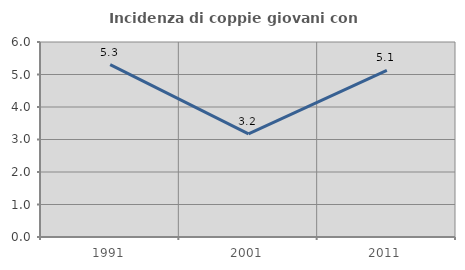
| Category | Incidenza di coppie giovani con figli |
|---|---|
| 1991.0 | 5.303 |
| 2001.0 | 3.175 |
| 2011.0 | 5.128 |